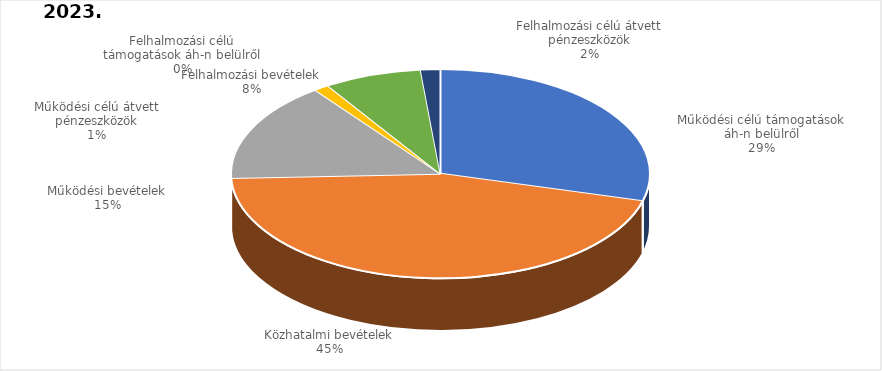
| Category | Series 1 | 2020. év |
|---|---|---|
| Működési célú támogatások áh-n belülről | 12588888000 | 7384765000 |
| Közhatalmi bevételek | 19426148000 | 14559920000 |
| Működési bevételek | 6652037000 | 6892862000 |
| Működési célú átvett pénzeszközök | 505982000 | 117000000 |
| Felhalmozási célú támogatások áh-n belülről | 0 | 819994000 |
| Felhalmozási bevételek | 3239100000 | 1138796000 |
| Felhalmozási célú átvett pénzeszközök | 650661000 | 9000000 |